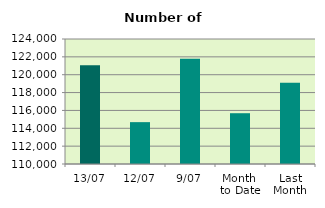
| Category | Series 0 |
|---|---|
| 13/07 | 121062 |
| 12/07 | 114688 |
| 9/07 | 121794 |
| Month 
to Date | 115687.111 |
| Last
Month | 119107.818 |